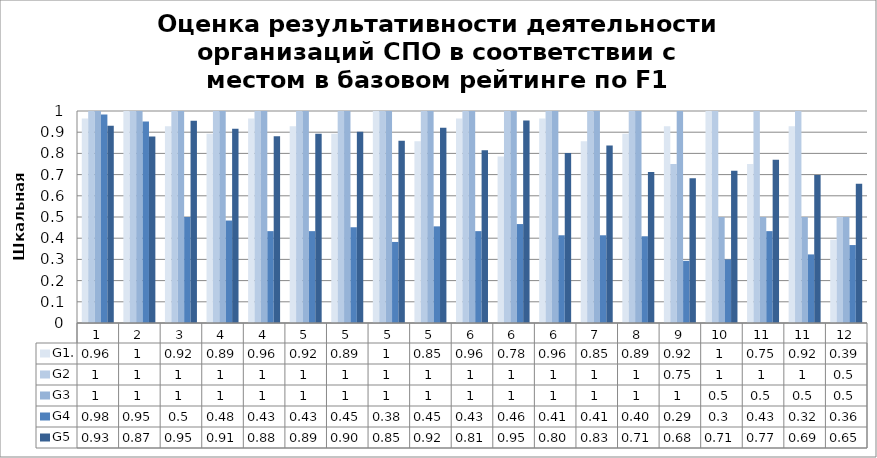
| Category | G1. | G2 | G3 | G4 | G5 |
|---|---|---|---|---|---|
| 1.0 | 0.964 | 1 | 1 | 0.983 | 0.93 |
| 2.0 | 1 | 1 | 1 | 0.95 | 0.879 |
| 3.0 | 0.929 | 1 | 1 | 0.5 | 0.954 |
| 4.0 | 0.893 | 1 | 1 | 0.483 | 0.916 |
| 4.0 | 0.964 | 1 | 1 | 0.433 | 0.881 |
| 5.0 | 0.929 | 1 | 1 | 0.433 | 0.892 |
| 5.0 | 0.893 | 1 | 1 | 0.452 | 0.902 |
| 5.0 | 1 | 1 | 1 | 0.382 | 0.86 |
| 5.0 | 0.857 | 1 | 1 | 0.456 | 0.922 |
| 6.0 | 0.964 | 1 | 1 | 0.433 | 0.815 |
| 6.0 | 0.786 | 1 | 1 | 0.467 | 0.956 |
| 6.0 | 0.964 | 1 | 1 | 0.414 | 0.802 |
| 7.0 | 0.857 | 1 | 1 | 0.414 | 0.837 |
| 8.0 | 0.893 | 1 | 1 | 0.409 | 0.712 |
| 9.0 | 0.929 | 0.75 | 1 | 0.293 | 0.683 |
| 10.0 | 1 | 1 | 0.5 | 0.3 | 0.718 |
| 11.0 | 0.75 | 1 | 0.5 | 0.433 | 0.771 |
| 11.0 | 0.929 | 1 | 0.5 | 0.324 | 0.699 |
| 12.0 | 0.393 | 0.5 | 0.5 | 0.368 | 0.656 |